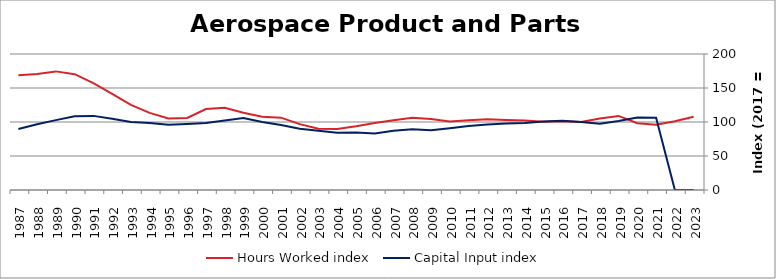
| Category | Hours Worked index | Capital Input index |
|---|---|---|
| 2023.0 | 107.609 | 0 |
| 2022.0 | 101.146 | 0 |
| 2021.0 | 96.084 | 106.395 |
| 2020.0 | 98.108 | 106.656 |
| 2019.0 | 108.927 | 101.314 |
| 2018.0 | 105.085 | 97.528 |
| 2017.0 | 100 | 100 |
| 2016.0 | 101.28 | 101.802 |
| 2015.0 | 100.437 | 100.79 |
| 2014.0 | 102.152 | 98.458 |
| 2013.0 | 102.991 | 97.742 |
| 2012.0 | 103.98 | 96.215 |
| 2011.0 | 102.73 | 93.946 |
| 2010.0 | 100.871 | 90.786 |
| 2009.0 | 104.478 | 87.784 |
| 2008.0 | 106.221 | 89.447 |
| 2007.0 | 102.501 | 87.166 |
| 2006.0 | 98.671 | 82.952 |
| 2005.0 | 93.722 | 84.473 |
| 2004.0 | 89.547 | 84.084 |
| 2003.0 | 90.195 | 87.022 |
| 2002.0 | 96.853 | 89.957 |
| 2001.0 | 106.36 | 95.435 |
| 2000.0 | 107.572 | 99.87 |
| 1999.0 | 113.698 | 105.775 |
| 1998.0 | 120.898 | 102.331 |
| 1997.0 | 119.098 | 98.47 |
| 1996.0 | 105.948 | 97.177 |
| 1995.0 | 105.247 | 95.985 |
| 1994.0 | 113.442 | 98.35 |
| 1993.0 | 125.054 | 100.065 |
| 1992.0 | 141.332 | 104.814 |
| 1991.0 | 157.262 | 109.003 |
| 1990.0 | 170.369 | 108.483 |
| 1989.0 | 174.433 | 102.741 |
| 1988.0 | 170.757 | 96.588 |
| 1987.0 | 168.661 | 89.731 |